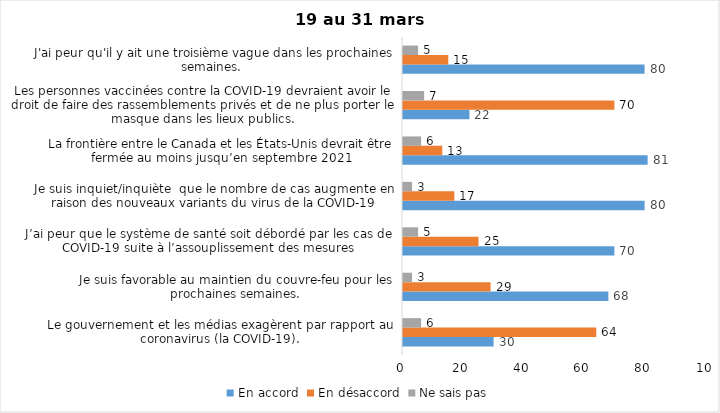
| Category | En accord | En désaccord | Ne sais pas |
|---|---|---|---|
| Le gouvernement et les médias exagèrent par rapport au coronavirus (la COVID-19). | 30 | 64 | 6 |
| Je suis favorable au maintien du couvre-feu pour les prochaines semaines. | 68 | 29 | 3 |
| J’ai peur que le système de santé soit débordé par les cas de COVID-19 suite à l’assouplissement des mesures | 70 | 25 | 5 |
| Je suis inquiet/inquiète  que le nombre de cas augmente en raison des nouveaux variants du virus de la COVID-19 | 80 | 17 | 3 |
| La frontière entre le Canada et les États-Unis devrait être fermée au moins jusqu’en septembre 2021 | 81 | 13 | 6 |
| Les personnes vaccinées contre la COVID-19 devraient avoir le droit de faire des rassemblements privés et de ne plus porter le masque dans les lieux publics. | 22 | 70 | 7 |
| J'ai peur qu'il y ait une troisième vague dans les prochaines semaines.  | 80 | 15 | 5 |